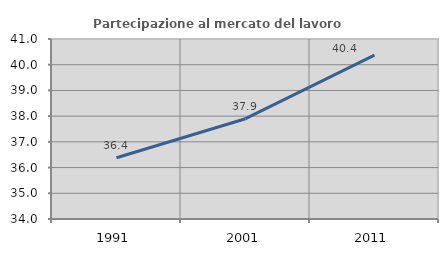
| Category | Partecipazione al mercato del lavoro  femminile |
|---|---|
| 1991.0 | 36.384 |
| 2001.0 | 37.9 |
| 2011.0 | 40.372 |